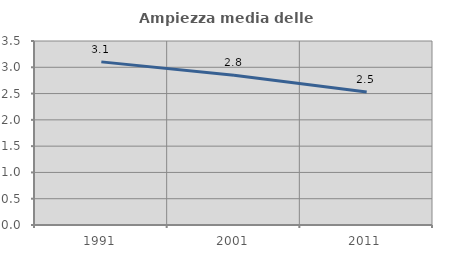
| Category | Ampiezza media delle famiglie |
|---|---|
| 1991.0 | 3.103 |
| 2001.0 | 2.847 |
| 2011.0 | 2.53 |